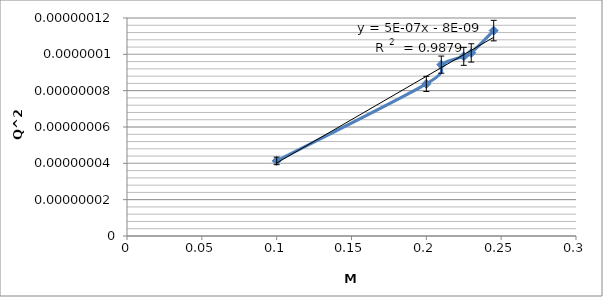
| Category | Series 0 |
|---|---|
| 0.1 | 0 |
| 0.2 | 0 |
| 0.21 | 0 |
| 0.225 | 0 |
| 0.23 | 0 |
| 0.245 | 0 |